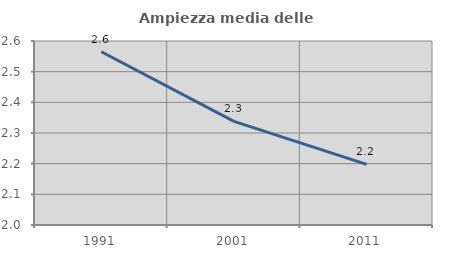
| Category | Ampiezza media delle famiglie |
|---|---|
| 1991.0 | 2.565 |
| 2001.0 | 2.338 |
| 2011.0 | 2.198 |